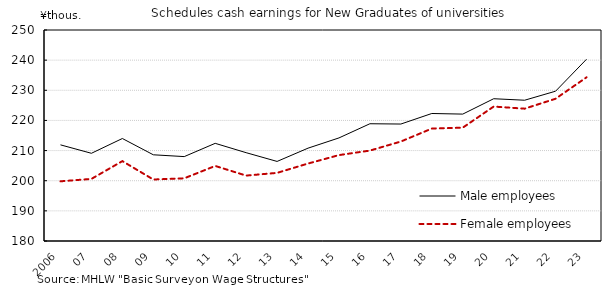
| Category | Male employees | Female employees |
|---|---|---|
| 2006 | 211.9 | 199.8 |
| 07 | 209.1 | 200.6 |
| 08 | 214 | 206.5 |
| 09 | 208.6 | 200.4 |
| 10 | 208 | 200.8 |
| 11 | 212.4 | 204.9 |
| 12 | 209.3 | 201.7 |
| 13 | 206.4 | 202.6 |
| 14 | 210.8 | 205.7 |
| 15 | 214.2 | 208.5 |
| 16 | 218.9 | 210 |
| 17 | 218.8 | 213 |
| 18 | 222.3 | 217.3 |
| 19 | 222.1 | 217.6 |
| 20 | 227.2 | 224.6 |
| 21 | 226.7 | 223.9 |
| 22 | 229.7 | 227.2 |
| 23 | 240.3 | 234.3 |